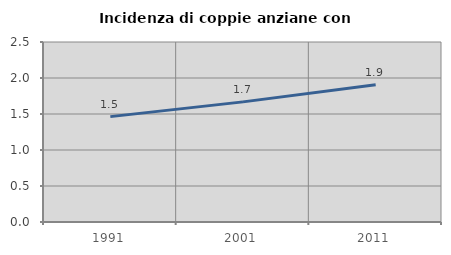
| Category | Incidenza di coppie anziane con figli |
|---|---|
| 1991.0 | 1.463 |
| 2001.0 | 1.668 |
| 2011.0 | 1.907 |